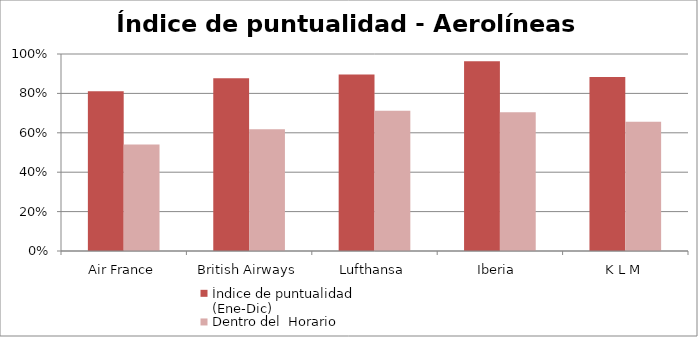
| Category | Índice de puntualidad
(Ene-Dic) | Dentro del  Horario |
|---|---|---|
| Air France | 0.811 | 0.54 |
| British Airways | 0.877 | 0.618 |
| Lufthansa | 0.896 | 0.711 |
| Iberia  | 0.963 | 0.704 |
| K L M | 0.884 | 0.657 |